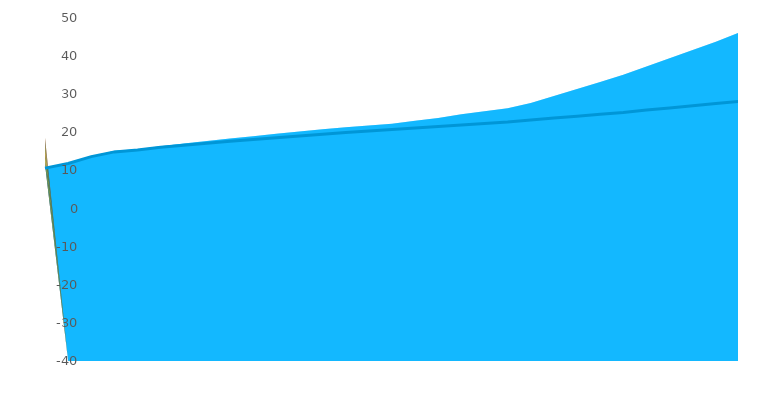
| Category | Asia Pacific Ref |
|---|---|
| 2020.0 | 10.608 |
| 2021.0 | 11.827 |
| 2022.0 | 13.631 |
| 2023.0 | 14.868 |
| 2024.0 | 15.34 |
| 2025.0 | 16.08 |
| 2026.0 | 16.621 |
| 2027.0 | 17.151 |
| 2028.0 | 17.648 |
| 2029.0 | 18.096 |
| 2030.0 | 18.571 |
| 2031.0 | 19.067 |
| 2032.0 | 19.503 |
| 2033.0 | 19.983 |
| 2034.0 | 20.367 |
| 2035.0 | 20.732 |
| 2036.0 | 21.158 |
| 2037.0 | 21.561 |
| 2038.0 | 21.938 |
| 2039.0 | 22.34 |
| 2040.0 | 22.708 |
| 2041.0 | 23.241 |
| 2042.0 | 23.755 |
| 2043.0 | 24.235 |
| 2044.0 | 24.718 |
| 2045.0 | 25.186 |
| 2046.0 | 25.83 |
| 2047.0 | 26.394 |
| 2048.0 | 26.979 |
| 2049.0 | 27.561 |
| 2050.0 | 28.094 |